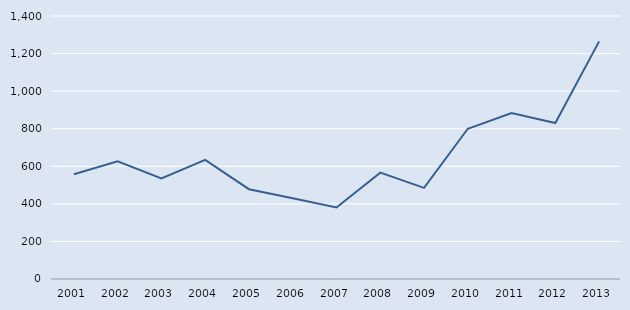
| Category | Series 0 |
|---|---|
| 2001.0 | 558 |
| 2002.0 | 627 |
| 2003.0 | 536 |
| 2004.0 | 634 |
| 2005.0 | 478 |
| 2006.0 | 430 |
| 2007.0 | 381 |
| 2008.0 | 566 |
| 2009.0 | 485 |
| 2010.0 | 800 |
| 2011.0 | 884 |
| 2012.0 | 830 |
| 2013.0 | 1265 |